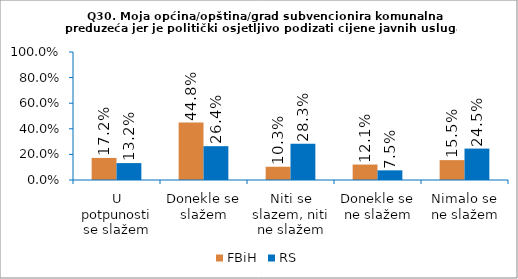
| Category | FBiH | RS |
|---|---|---|
| U potpunosti se slažem | 0.172 | 0.132 |
| Donekle se slažem | 0.448 | 0.264 |
| Niti se slazem, niti ne slažem | 0.103 | 0.283 |
| Donekle se ne slažem | 0.121 | 0.075 |
| Nimalo se ne slažem | 0.155 | 0.245 |